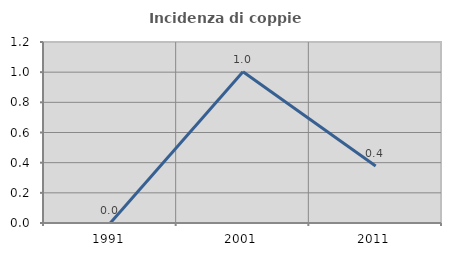
| Category | Incidenza di coppie miste |
|---|---|
| 1991.0 | 0 |
| 2001.0 | 1.003 |
| 2011.0 | 0.377 |